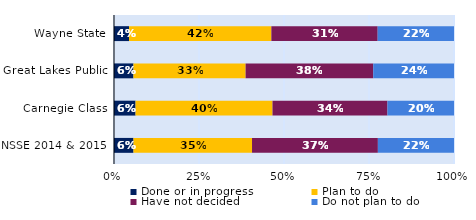
| Category | Done or in progress | Plan to do | Have not decided | Do not plan to do |
|---|---|---|---|---|
| Wayne State | 0.044 | 0.419 | 0.313 | 0.224 |
| Great Lakes Public | 0.057 | 0.33 | 0.375 | 0.238 |
| Carnegie Class | 0.063 | 0.403 | 0.338 | 0.196 |
| NSSE 2014 & 2015 | 0.057 | 0.349 | 0.37 | 0.224 |